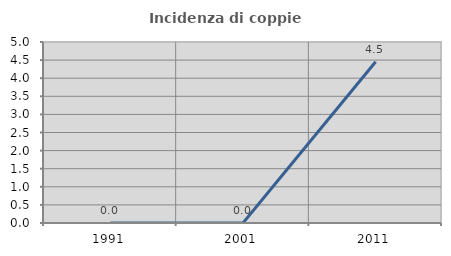
| Category | Incidenza di coppie miste |
|---|---|
| 1991.0 | 0 |
| 2001.0 | 0 |
| 2011.0 | 4.453 |